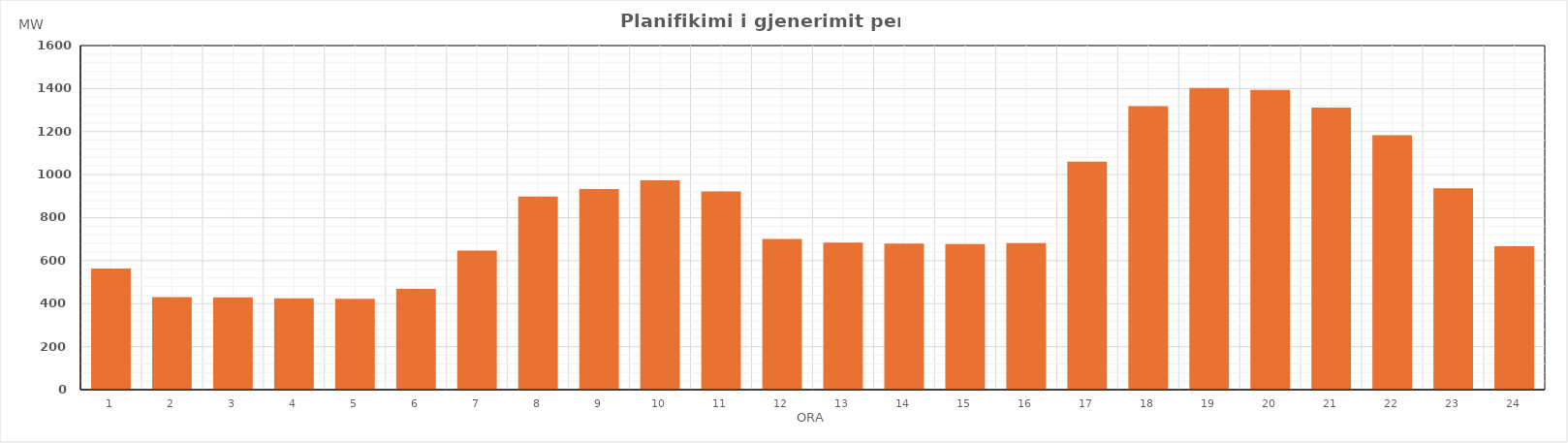
| Category | Max (MW) |
|---|---|
| 0 | 563.51 |
| 1 | 430.7 |
| 2 | 428.98 |
| 3 | 424.98 |
| 4 | 421.98 |
| 5 | 469.18 |
| 6 | 646.99 |
| 7 | 898.28 |
| 8 | 933.16 |
| 9 | 973.03 |
| 10 | 921.5 |
| 11 | 700.75 |
| 12 | 683.66 |
| 13 | 679.65 |
| 14 | 677.43 |
| 15 | 681.47 |
| 16 | 1060.33 |
| 17 | 1318.33 |
| 18 | 1402.89 |
| 19 | 1393.4 |
| 20 | 1312.11 |
| 21 | 1183.23 |
| 22 | 936.82 |
| 23 | 667.52 |